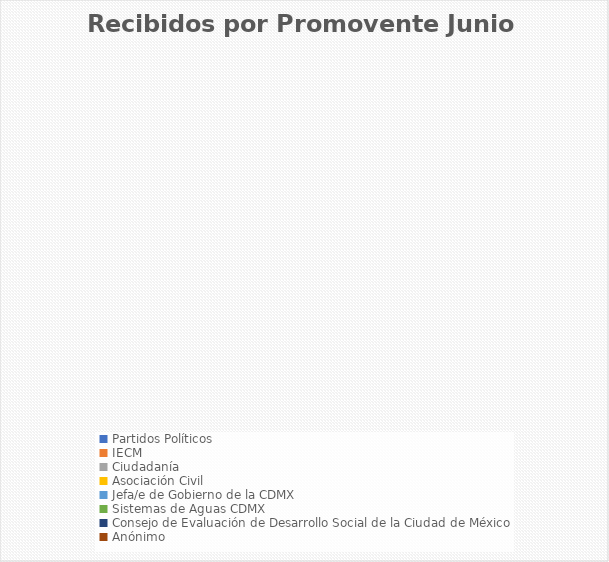
| Category | Recibidos por Promovente Junio |
|---|---|
| Partidos Políticos | 0 |
| IECM | 0 |
| Ciudadanía  | 0 |
| Asociación Civil | 0 |
| Jefa/e de Gobierno de la CDMX | 0 |
| Sistemas de Aguas CDMX | 0 |
| Consejo de Evaluación de Desarrollo Social de la Ciudad de México | 0 |
| Anónimo | 0 |